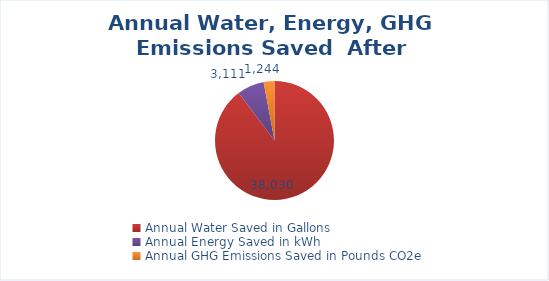
| Category | Series 0 |
|---|---|
| Annual Water Saved in Gallons | 38030 |
| Annual Energy Saved in kWh | 3111.29 |
| Annual GHG Emissions Saved in Pounds CO2e | 1244.15 |